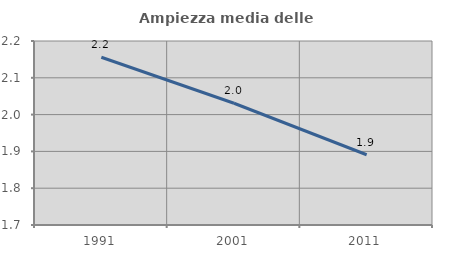
| Category | Ampiezza media delle famiglie |
|---|---|
| 1991.0 | 2.156 |
| 2001.0 | 2.031 |
| 2011.0 | 1.891 |